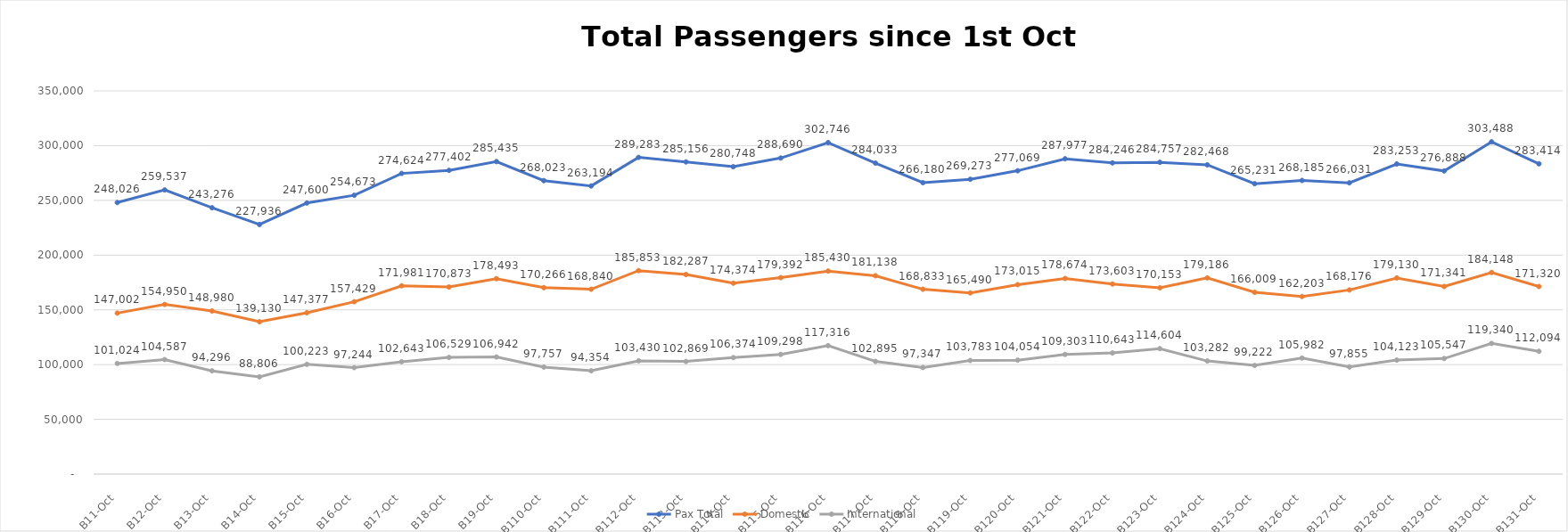
| Category | Pax Total |  Domestic  |  International  |
|---|---|---|---|
| 2022-10-01 | 248026 | 147002 | 101024 |
| 2022-10-02 | 259537 | 154950 | 104587 |
| 2022-10-03 | 243276 | 148980 | 94296 |
| 2022-10-04 | 227936 | 139130 | 88806 |
| 2022-10-05 | 247600 | 147377 | 100223 |
| 2022-10-06 | 254673 | 157429 | 97244 |
| 2022-10-07 | 274624 | 171981 | 102643 |
| 2022-10-08 | 277402 | 170873 | 106529 |
| 2022-10-09 | 285435 | 178493 | 106942 |
| 2022-10-10 | 268023 | 170266 | 97757 |
| 2022-10-11 | 263194 | 168840 | 94354 |
| 2022-10-12 | 289283 | 185853 | 103430 |
| 2022-10-13 | 285156 | 182287 | 102869 |
| 2022-10-14 | 280748 | 174374 | 106374 |
| 2022-10-15 | 288690 | 179392 | 109298 |
| 2022-10-16 | 302746 | 185430 | 117316 |
| 2022-10-17 | 284033 | 181138 | 102895 |
| 2022-10-18 | 266180 | 168833 | 97347 |
| 2022-10-19 | 269273 | 165490 | 103783 |
| 2022-10-20 | 277069 | 173015 | 104054 |
| 2022-10-21 | 287977 | 178674 | 109303 |
| 2022-10-22 | 284246 | 173603 | 110643 |
| 2022-10-23 | 284757 | 170153 | 114604 |
| 2022-10-24 | 282468 | 179186 | 103282 |
| 2022-10-25 | 265231 | 166009 | 99222 |
| 2022-10-26 | 268185 | 162203 | 105982 |
| 2022-10-27 | 266031 | 168176 | 97855 |
| 2022-10-28 | 283253 | 179130 | 104123 |
| 2022-10-29 | 276888 | 171341 | 105547 |
| 2022-10-30 | 303488 | 184148 | 119340 |
| 2022-10-31 | 283414 | 171320 | 112094 |